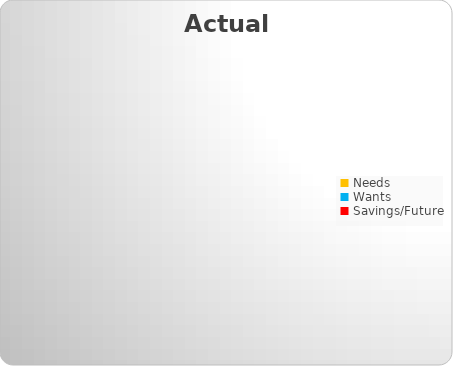
| Category | Series 0 |
|---|---|
| Needs | 0 |
| Wants | 0 |
| Savings/Future | 0 |